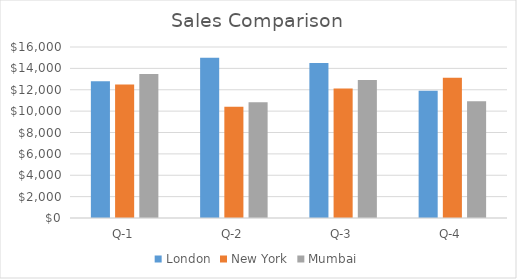
| Category | London | New York | Mumbai |
|---|---|---|---|
| Q-1 | 12800 | 12498 | 13476 |
| Q-2 | 14986 | 10412 | 10822 |
| Q-3 | 14511 | 12119 | 12902 |
| Q-4 | 11914 | 13122 | 10935 |